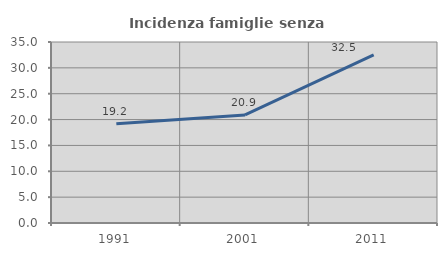
| Category | Incidenza famiglie senza nuclei |
|---|---|
| 1991.0 | 19.205 |
| 2001.0 | 20.904 |
| 2011.0 | 32.502 |